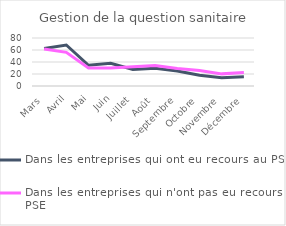
| Category | Dans les entreprises qui ont eu recours au PSE  | Dans les entreprises qui n'ont pas eu recours au PSE  |
|---|---|---|
| Mars | 62.542 | 61.538 |
| Avril | 68.376 | 56.131 |
| Mai | 34.485 | 30.095 |
| Juin | 37.852 | 30.203 |
| Juillet | 27.51 | 31.935 |
| Août | 29.416 | 34.175 |
| Septembre | 25.043 | 29.219 |
| Octobre | 17.966 | 25.708 |
| Novembre | 13.953 | 20.218 |
| Décembre | 15.449 | 22.323 |